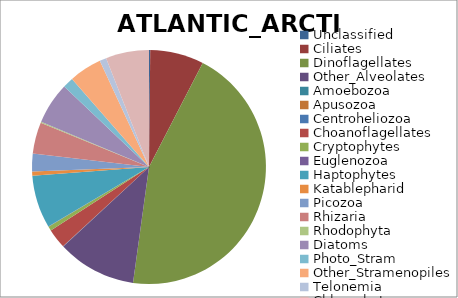
| Category | ATLANTIC_ARCTIC |
|---|---|
| Unclassified | 0.002 |
| Ciliates | 0.074 |
| Dinoflagellates | 0.446 |
| Other_Alveolates | 0.109 |
| Amoebozoa | 0 |
| Apusozoa | 0 |
| Centroheliozoa | 0 |
| Choanoflagellates | 0.027 |
| Cryptophytes | 0.006 |
| Euglenozoa | 0 |
| Haptophytes | 0.073 |
| Katablepharid | 0.006 |
| Picozoa | 0.024 |
| Rhizaria | 0.044 |
| Rhodophyta | 0.001 |
| Diatoms | 0.058 |
| Photo_Stram | 0.015 |
| Other_Stramenopiles | 0.045 |
| Telonemia | 0.009 |
| Chlorophytes | 0.06 |